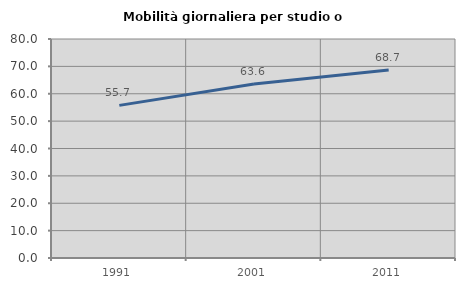
| Category | Mobilità giornaliera per studio o lavoro |
|---|---|
| 1991.0 | 55.748 |
| 2001.0 | 63.597 |
| 2011.0 | 68.671 |